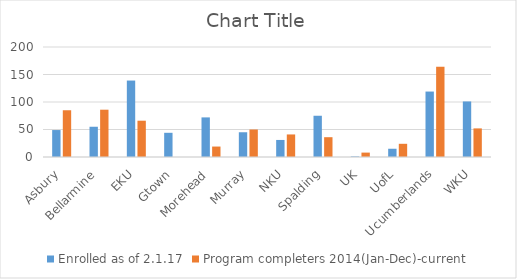
| Category | Enrolled as of 2.1.17 | Program completers 2014(Jan-Dec)-current |
|---|---|---|
| Asbury | 49 | 85 |
| Bellarmine | 55 | 86 |
| EKU | 139 | 66 |
| Gtown | 44 | 0 |
| Morehead | 72 | 19 |
| Murray | 45 | 50 |
| NKU | 31 | 41 |
| Spalding | 75 | 36 |
| UK | 1 | 8 |
| UofL | 15 | 24 |
| Ucumberlands | 119 | 164 |
| WKU | 101 | 52 |